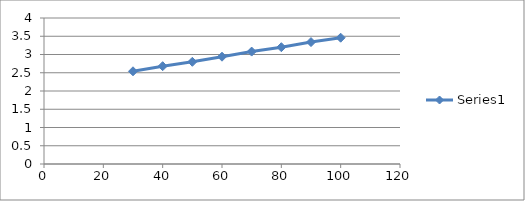
| Category | Series 0 |
|---|---|
| 100.0 | 3.46 |
| 90.0 | 3.34 |
| 80.0 | 3.2 |
| 70.0 | 3.08 |
| 60.0 | 2.94 |
| 50.0 | 2.8 |
| 40.0 | 2.68 |
| 30.0 | 2.54 |